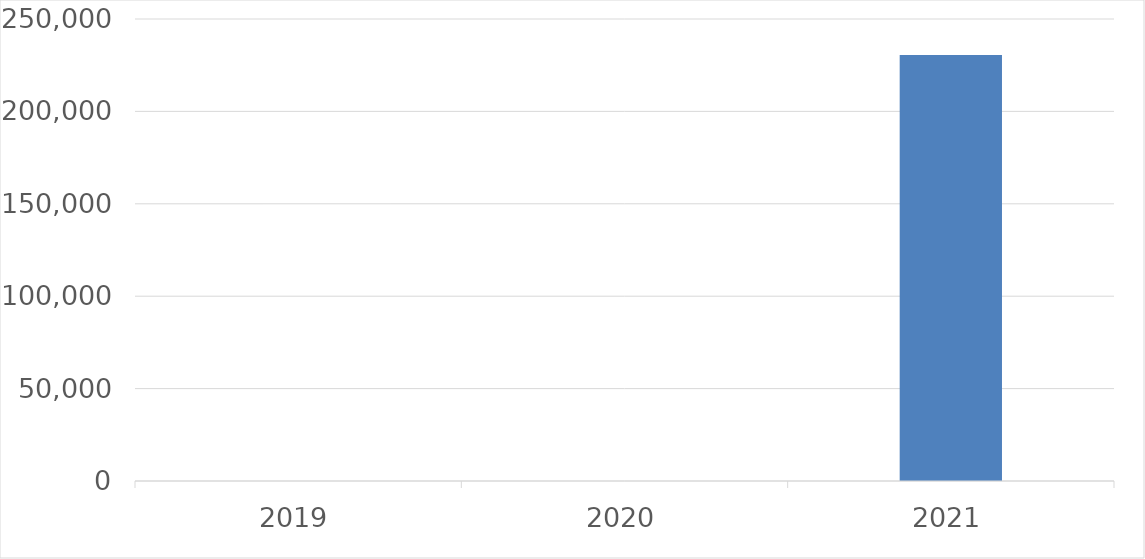
| Category | Series 0 |
|---|---|
| 2019 | 0 |
| 2020 | 0 |
| 2021 | 230580 |